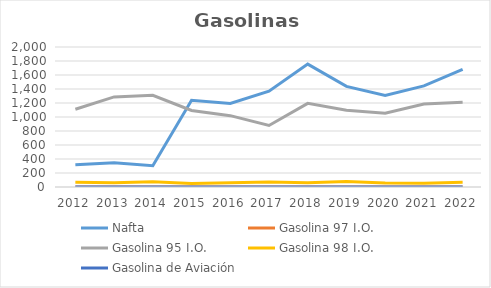
| Category | Nafta | Gasolina 97 I.O. | Gasolina 95 I.O. | Gasolina 98 I.O. | Gasolina de Aviación |
|---|---|---|---|---|---|
| 2012.0 | 317.795 | 0 | 1111.158 | 69.297 | 0 |
| 2013.0 | 345.084 | 0 | 1287.229 | 59.606 | 0 |
| 2014.0 | 303.507 | 0 | 1309.315 | 75.367 | 0 |
| 2015.0 | 1240 | 0 | 1093.296 | 50.234 | 0 |
| 2016.0 | 1194 | 0 | 1019.001 | 60.134 | 0 |
| 2017.0 | 1368 | 0 | 878.405 | 71.317 | 0 |
| 2018.0 | 1756 | 0 | 1195.105 | 61.75 | 0 |
| 2019.0 | 1438 | 0 | 1095.317 | 77.354 | 0 |
| 2020.0 | 1309 | 0 | 1053.175 | 58.757 | 0 |
| 2021.0 | 1443.748 | 0 | 1186.881 | 55.306 | 0 |
| 2022.0 | 1678.689 | 0 | 1211.8 | 66.106 | 0 |